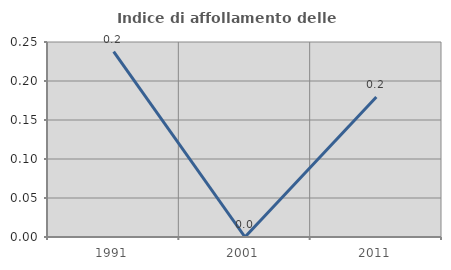
| Category | Indice di affollamento delle abitazioni  |
|---|---|
| 1991.0 | 0.238 |
| 2001.0 | 0 |
| 2011.0 | 0.18 |